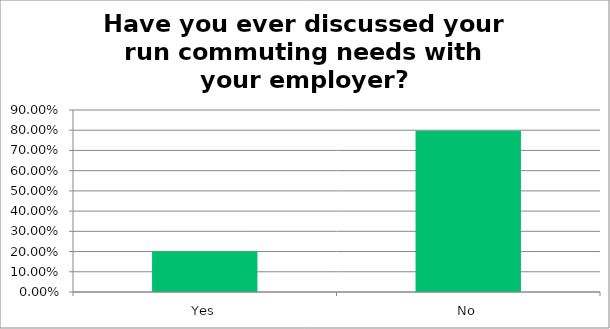
| Category | Responses |
|---|---|
| Yes | 0.202 |
| No | 0.798 |